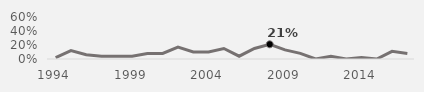
| Category | Saturday |
|---|---|
| 1994.0 | 0.02 |
| 1995.0 | 0.12 |
| 1996.0 | 0.06 |
| 1997.0 | 0.04 |
| 1998.0 | 0.04 |
| 1999.0 | 0.04 |
| 2000.0 | 0.08 |
| 2001.0 | 0.08 |
| 2002.0 | 0.17 |
| 2003.0 | 0.1 |
| 2004.0 | 0.1 |
| 2005.0 | 0.15 |
| 2006.0 | 0.04 |
| 2007.0 | 0.15 |
| 2008.0 | 0.21 |
| 2009.0 | 0.13 |
| 2010.0 | 0.08 |
| 2011.0 | 0 |
| 2012.0 | 0.04 |
| 2013.0 | 0 |
| 2014.0 | 0.02 |
| 2015.0 | 0 |
| 2016.0 | 0.11 |
| 2017.0 | 0.08 |